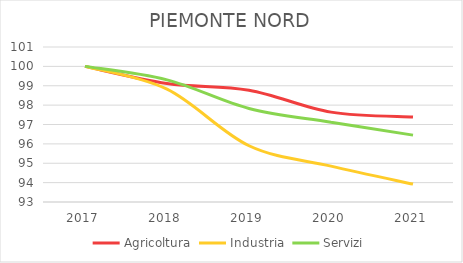
| Category | Agricoltura | Industria | Servizi |
|---|---|---|---|
| 2017.0 | 100 | 100 | 100 |
| 2018.0 | 99.121 | 98.823 | 99.305 |
| 2019.0 | 98.771 | 95.904 | 97.829 |
| 2020.0 | 97.639 | 94.851 | 97.119 |
| 2021.0 | 97.386 | 93.926 | 96.451 |